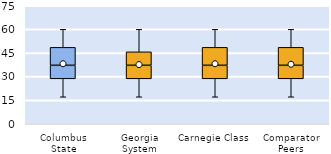
| Category | 25th | 50th | 75th |
|---|---|---|---|
| Columbus State | 28.571 | 8.571 | 11.429 |
| Georgia System | 28.571 | 8.571 | 8.571 |
| Carnegie Class | 28.571 | 8.571 | 11.429 |
| Comparator Peers | 28.571 | 8.571 | 11.429 |